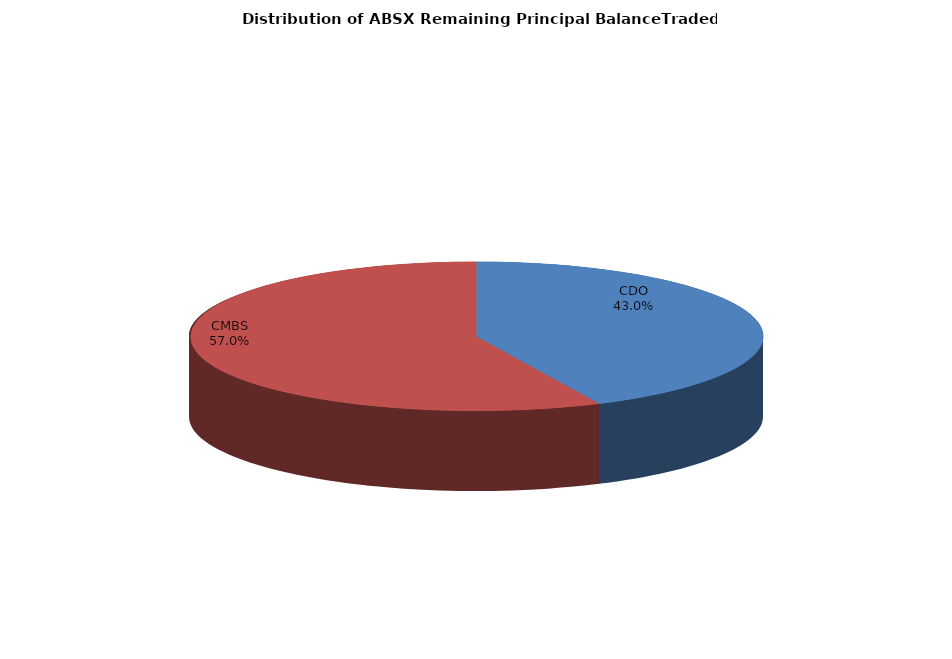
| Category | Series 0 |
|---|---|
| CDO | 1389878923.245 |
| CMBS | 1845897843.346 |